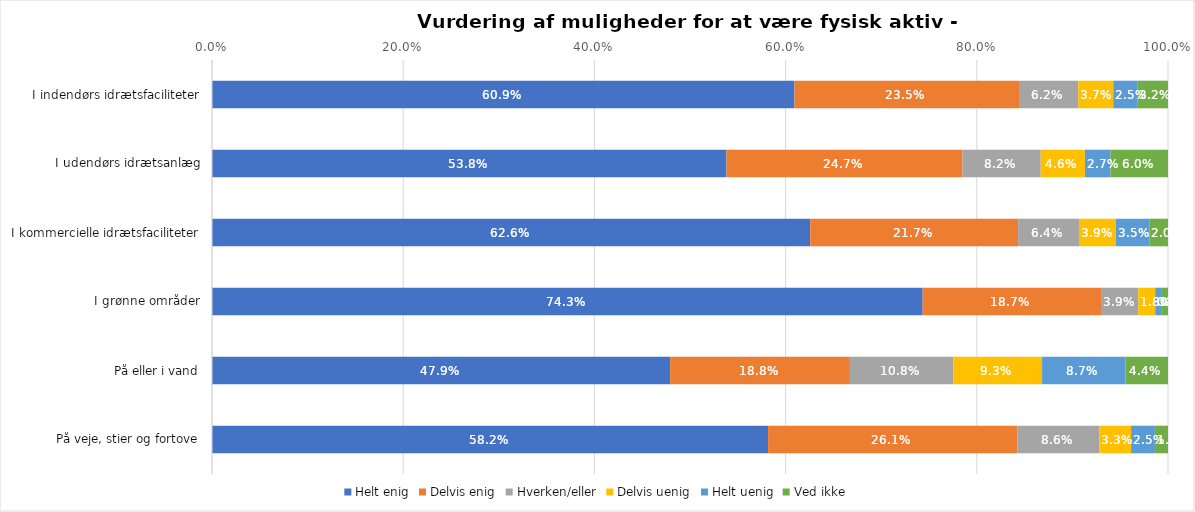
| Category | Helt enig | Delvis enig | Hverken/eller | Delvis uenig | Helt uenig | Ved ikke |
|---|---|---|---|---|---|---|
| I indendørs idrætsfaciliteter | 0.609 | 0.235 | 0.062 | 0.037 | 0.025 | 0.032 |
| I udendørs idrætsanlæg | 0.538 | 0.247 | 0.082 | 0.046 | 0.027 | 0.06 |
| I kommercielle idrætsfaciliteter | 0.626 | 0.217 | 0.064 | 0.039 | 0.035 | 0.02 |
| I grønne områder | 0.743 | 0.187 | 0.039 | 0.018 | 0.007 | 0.006 |
| På eller i vand | 0.479 | 0.188 | 0.108 | 0.093 | 0.087 | 0.044 |
| På veje, stier og fortove | 0.582 | 0.261 | 0.086 | 0.033 | 0.025 | 0.014 |